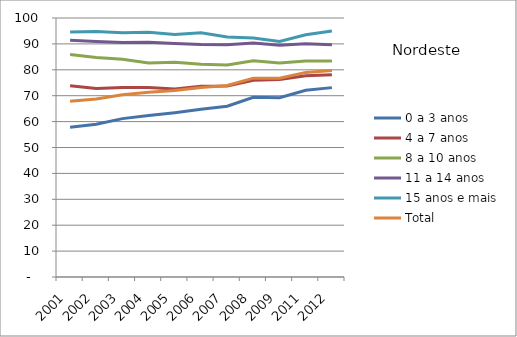
| Category | 0 a 3 anos | 4 a 7 anos | 8 a 10 anos | 11 a 14 anos | 15 anos e mais | Total |
|---|---|---|---|---|---|---|
| 2001.0 | 57.78 | 73.8 | 85.91 | 91.44 | 94.55 | 67.85 |
| 2002.0 | 58.98 | 72.79 | 84.74 | 90.96 | 94.76 | 68.75 |
| 2003.0 | 61.15 | 73.19 | 84.03 | 90.54 | 94.31 | 70.37 |
| 2004.0 | 62.36 | 73.12 | 82.64 | 90.64 | 94.46 | 71.31 |
| 2005.0 | 63.44 | 72.62 | 82.93 | 90.18 | 93.59 | 71.98 |
| 2006.0 | 64.74 | 73.65 | 82.11 | 89.81 | 94.34 | 73.19 |
| 2007.0 | 65.91 | 73.72 | 81.82 | 89.68 | 92.66 | 73.97 |
| 2008.0 | 69.37 | 75.96 | 83.49 | 90.37 | 92.29 | 76.78 |
| 2009.0 | 69.24 | 76.22 | 82.62 | 89.45 | 90.95 | 76.71 |
| 2011.0 | 72.12 | 77.68 | 83.35 | 90.03 | 93.55 | 79 |
| 2012.0 | 73.12 | 78.1 | 83.36 | 89.65 | 95.02 | 79.72 |